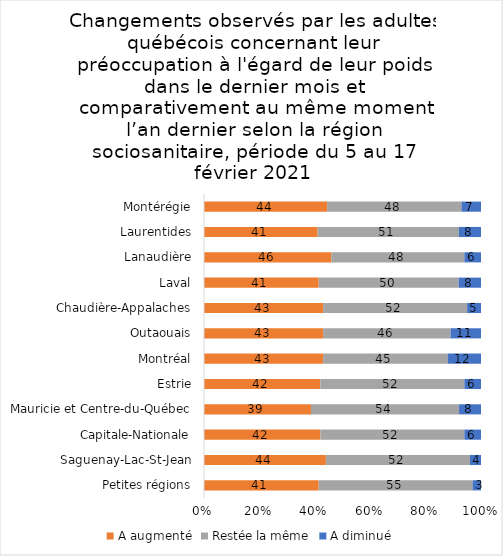
| Category | A augmenté | Restée la même | A diminué |
|---|---|---|---|
| Petites régions | 41 | 55 | 3 |
| Saguenay-Lac-St-Jean | 44 | 52 | 4 |
| Capitale-Nationale | 42 | 52 | 6 |
| Mauricie et Centre-du-Québec | 39 | 54 | 8 |
| Estrie | 42 | 52 | 6 |
| Montréal | 43 | 45 | 12 |
| Outaouais | 43 | 46 | 11 |
| Chaudière-Appalaches | 43 | 52 | 5 |
| Laval | 41 | 50 | 8 |
| Lanaudière | 46 | 48 | 6 |
| Laurentides | 41 | 51 | 8 |
| Montérégie | 44 | 48 | 7 |